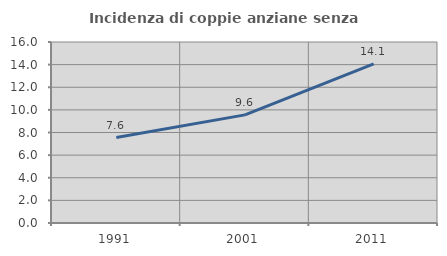
| Category | Incidenza di coppie anziane senza figli  |
|---|---|
| 1991.0 | 7.553 |
| 2001.0 | 9.556 |
| 2011.0 | 14.058 |